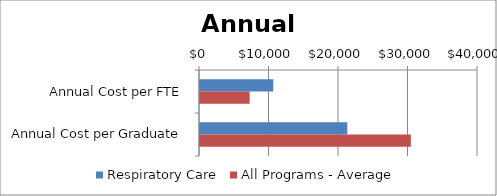
| Category | Respiratory Care | All Programs - Average |
|---|---|---|
| Annual Cost per FTE | 10541.675 | 7144 |
| Annual Cost per Graduate | 21200.48 | 30340 |